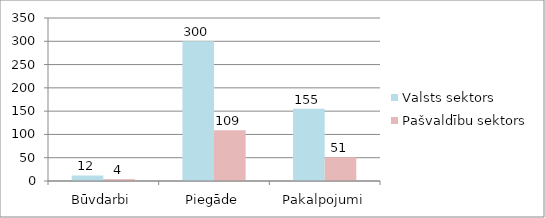
| Category | Valsts sektors | Pašvaldību sektors |
|---|---|---|
| Būvdarbi | 12 | 4 |
| Piegāde | 300 | 109 |
| Pakalpojumi | 155 | 51 |